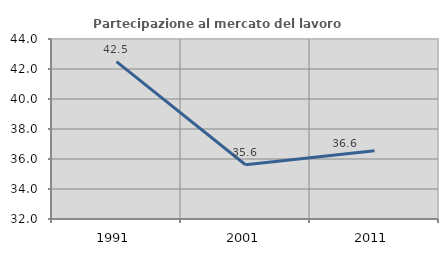
| Category | Partecipazione al mercato del lavoro  femminile |
|---|---|
| 1991.0 | 42.489 |
| 2001.0 | 35.614 |
| 2011.0 | 36.55 |